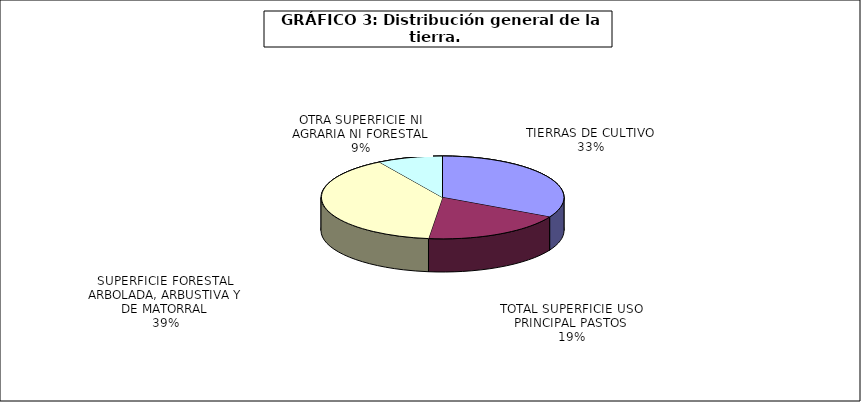
| Category | Series 0 |
|---|---|
| TIERRAS DE CULTIVO | 16609816.44 |
| TOTAL SUPERFICIE USO PRINCIPAL PASTOS | 9618630 |
| SUPERFICIE FORESTAL ARBOLADA, ARBUSTIVA Y DE MATORRAL | 19967549 |
| OTRA SUPERFICIE NI AGRARIA NI FORESTAL | 4400464 |